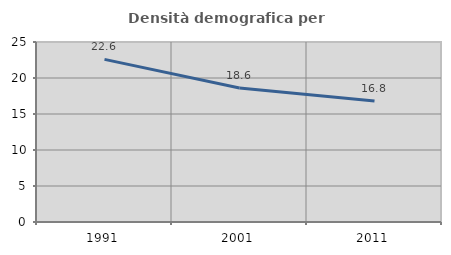
| Category | Densità demografica |
|---|---|
| 1991.0 | 22.586 |
| 2001.0 | 18.62 |
| 2011.0 | 16.798 |